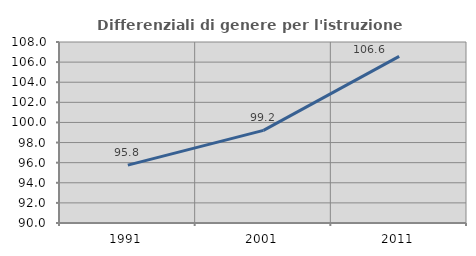
| Category | Differenziali di genere per l'istruzione superiore |
|---|---|
| 1991.0 | 95.76 |
| 2001.0 | 99.208 |
| 2011.0 | 106.567 |